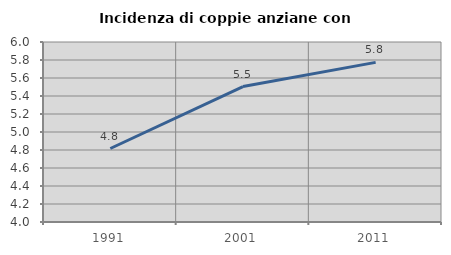
| Category | Incidenza di coppie anziane con figli |
|---|---|
| 1991.0 | 4.817 |
| 2001.0 | 5.505 |
| 2011.0 | 5.774 |